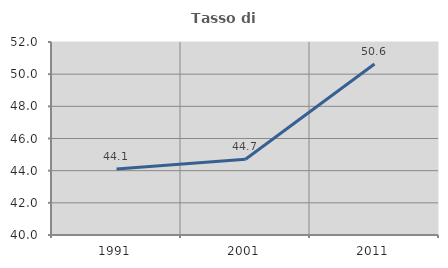
| Category | Tasso di occupazione   |
|---|---|
| 1991.0 | 44.11 |
| 2001.0 | 44.706 |
| 2011.0 | 50.629 |